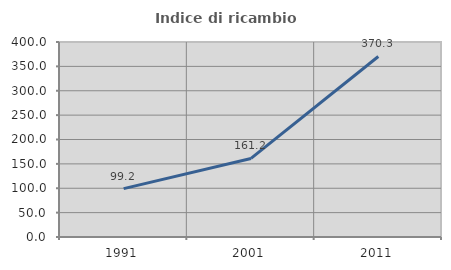
| Category | Indice di ricambio occupazionale  |
|---|---|
| 1991.0 | 99.213 |
| 2001.0 | 161.157 |
| 2011.0 | 370.27 |